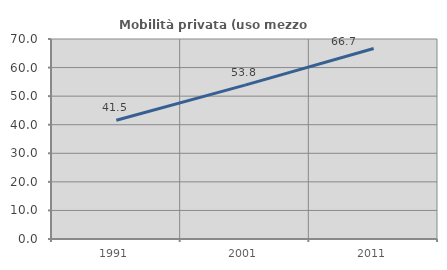
| Category | Mobilità privata (uso mezzo privato) |
|---|---|
| 1991.0 | 41.538 |
| 2001.0 | 53.846 |
| 2011.0 | 66.667 |